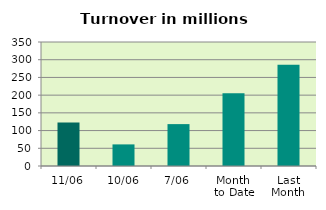
| Category | Series 0 |
|---|---|
| 11/06 | 122.476 |
| 10/06 | 60.968 |
| 7/06 | 118.238 |
| Month 
to Date | 205.546 |
| Last
Month | 285.992 |